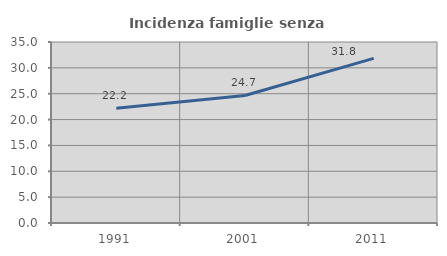
| Category | Incidenza famiglie senza nuclei |
|---|---|
| 1991.0 | 22.186 |
| 2001.0 | 24.662 |
| 2011.0 | 31.835 |